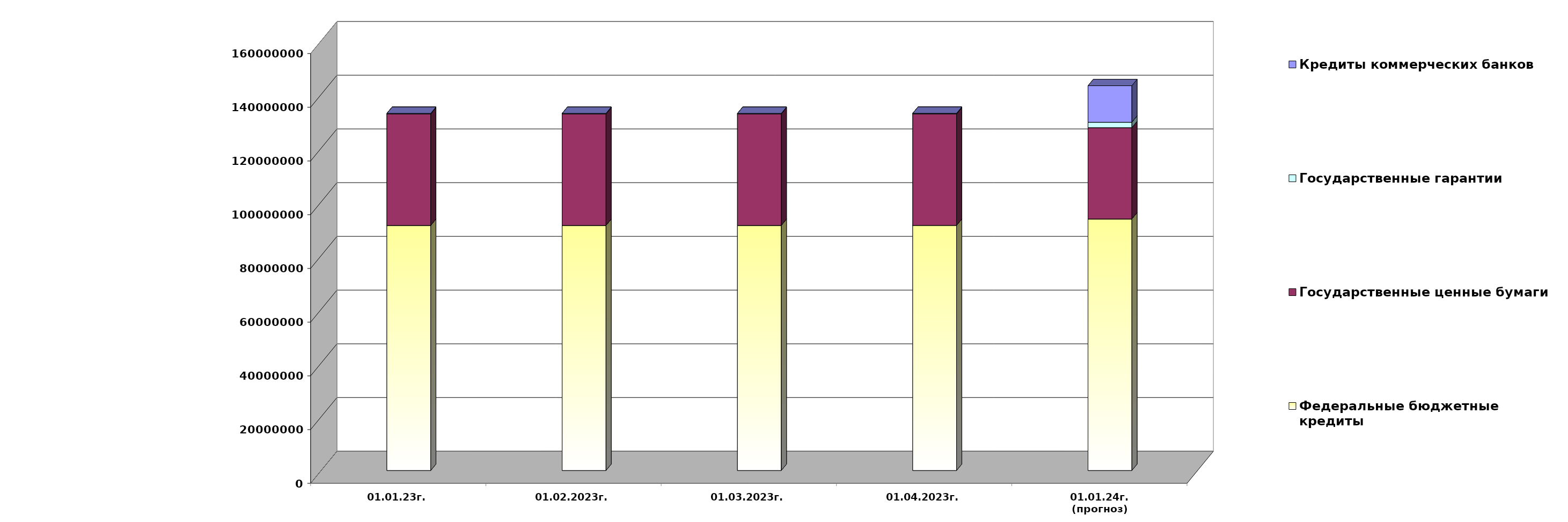
| Category | Федеральные бюджетные кредиты | Государственные ценные бумаги  | Государственные гарантии | Кредиты коммерческих банков |
|---|---|---|---|---|
| 01.01.23г. | 91228290.06 | 41500000 | 219957.743 | 0 |
| 01.02.2023г. | 91228290.06 | 41500000 | 217186.67 | 0 |
| 01.03.2023г. | 91228290.06 | 41500000 | 217186.67 | 0 |
| 01.04.2023г. | 91246617.843 | 41500000 | 218702.544 | 0 |
| 01.01.24г.
(прогноз) | 93636248.9 | 34000000 | 2011427.8 | 13609366 |